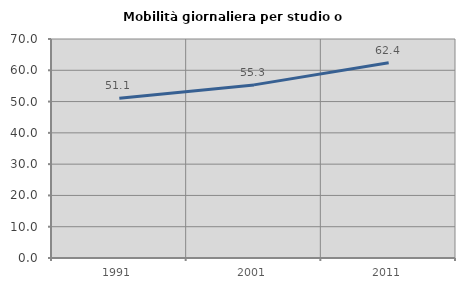
| Category | Mobilità giornaliera per studio o lavoro |
|---|---|
| 1991.0 | 51.064 |
| 2001.0 | 55.333 |
| 2011.0 | 62.434 |